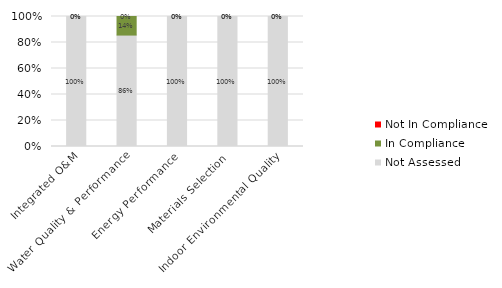
| Category | Not Assessed | In Compliance | Not In Compliance |
|---|---|---|---|
| Integrated O&M | 1 | 0 | 0 |
| Water Quality & Performance | 0.857 | 0.143 | 0 |
| Energy Performance | 1 | 0 | 0 |
| Materials Selection | 1 | 0 | 0 |
| Indoor Environmental Quality | 1 | 0 | 0 |